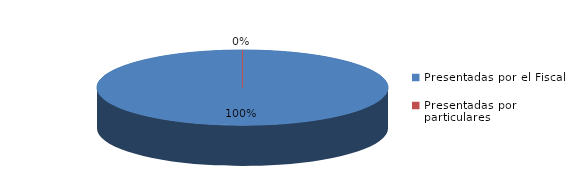
| Category | Series 0 |
|---|---|
| Presentadas por el Fiscal | 122 |
| Presentadas por particulares | 0 |